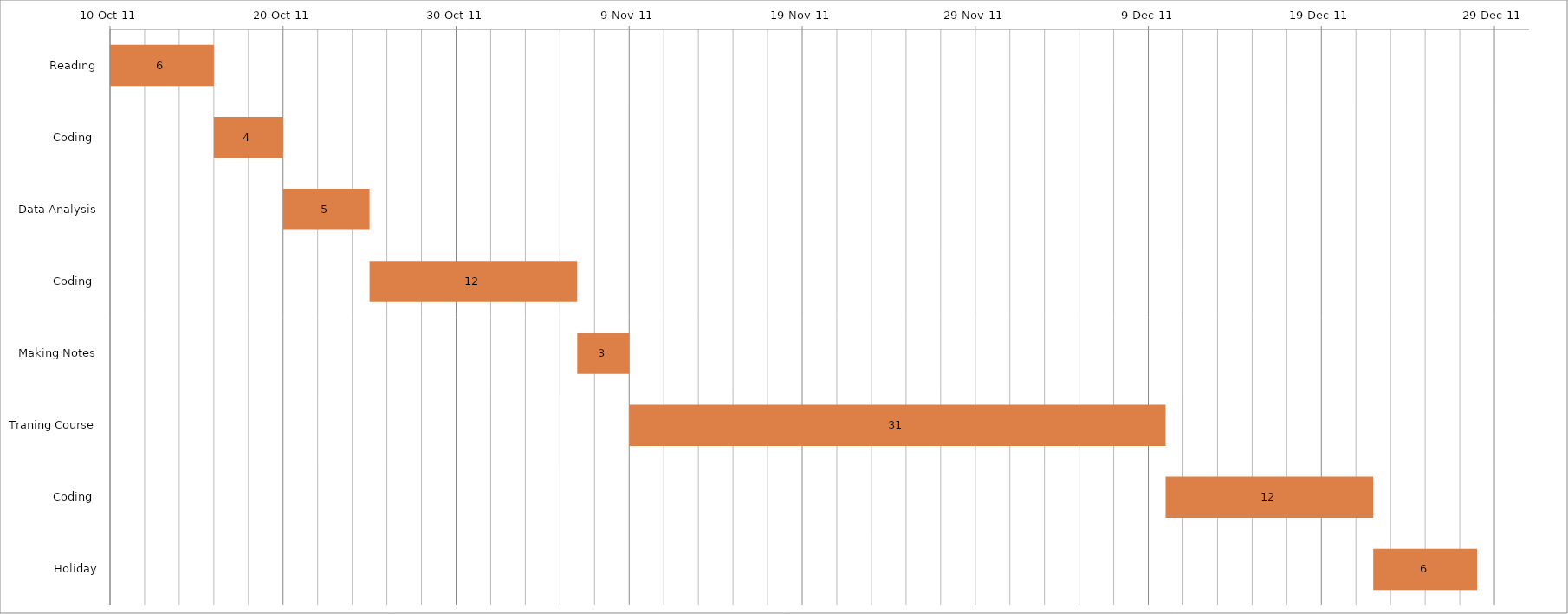
| Category | Date | Number of Days |
|---|---|---|
| Reading | 2011-10-10 | 6 |
| Coding  | 2011-10-16 | 4 |
| Data Analysis | 2011-10-20 | 5 |
| Coding  | 2011-10-25 | 12 |
| Making Notes | 2011-11-06 | 3 |
| Traning Course | 2011-11-09 | 31 |
| Coding  | 2011-12-10 | 12 |
| Holiday | 2011-12-22 | 6 |